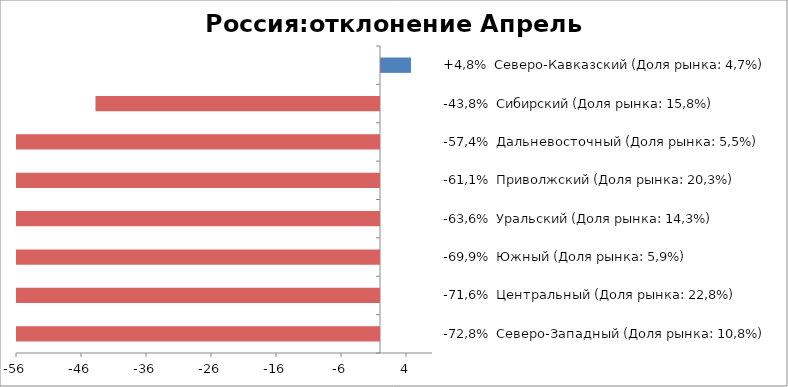
| Category | Россия:отклонение Апрель 2015-2014 |
|---|---|
| -72,8%  Северо-Западный (Доля рынка: 10,8%) | -72.8 |
| -71,6%  Центральный (Доля рынка: 22,8%) | -71.636 |
| -69,9%  Южный (Доля рынка: 5,9%) | -69.892 |
| -63,6%  Уральский (Доля рынка: 14,3%) | -63.612 |
| -61,1%  Приволжский (Доля рынка: 20,3%) | -61.055 |
| -57,4%  Дальневосточный (Доля рынка: 5,5%) | -57.377 |
| -43,8%  Сибирский (Доля рынка: 15,8%) | -43.774 |
| +4,8%  Северо-Кавказский (Доля рынка: 4,7%) | 4.762 |